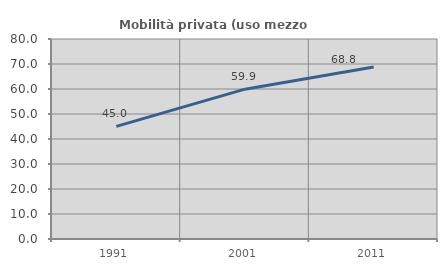
| Category | Mobilità privata (uso mezzo privato) |
|---|---|
| 1991.0 | 45.035 |
| 2001.0 | 59.935 |
| 2011.0 | 68.803 |